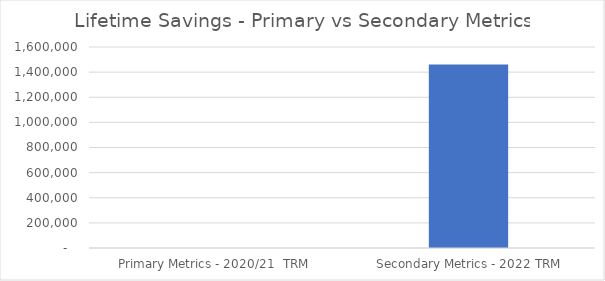
| Category | Series 0 |
|---|---|
| Primary Metrics - 2020/21  TRM | 0 |
| Secondary Metrics - 2022 TRM | 1461054.416 |